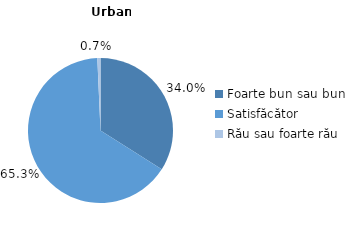
| Category | Series 0 |
|---|---|
| Foarte bun sau bun | 34 |
| Satisfăcător | 65.3 |
| Rău sau foarte rău | 0.7 |